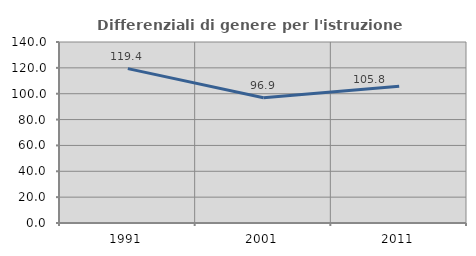
| Category | Differenziali di genere per l'istruzione superiore |
|---|---|
| 1991.0 | 119.406 |
| 2001.0 | 96.857 |
| 2011.0 | 105.807 |